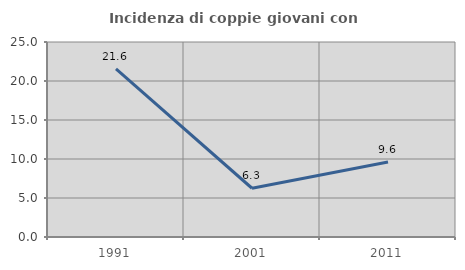
| Category | Incidenza di coppie giovani con figli |
|---|---|
| 1991.0 | 21.569 |
| 2001.0 | 6.25 |
| 2011.0 | 9.615 |